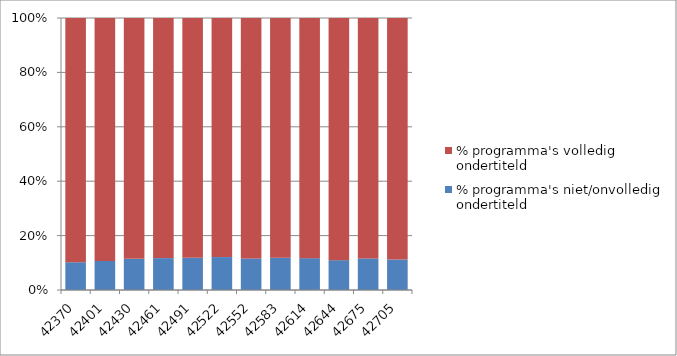
| Category | % programma's niet/onvolledig ondertiteld | % programma's volledig ondertiteld |
|---|---|---|
| 42370.0 | 0.102 | 0.898 |
| 42401.0 | 0.107 | 0.893 |
| 42430.0 | 0.115 | 0.885 |
| 42461.0 | 0.117 | 0.883 |
| 42491.0 | 0.118 | 0.882 |
| 42522.0 | 0.121 | 0.879 |
| 42552.0 | 0.116 | 0.884 |
| 42583.0 | 0.119 | 0.881 |
| 42614.0 | 0.117 | 0.883 |
| 42644.0 | 0.11 | 0.89 |
| 42675.0 | 0.116 | 0.884 |
| 42705.0 | 0.112 | 0.888 |